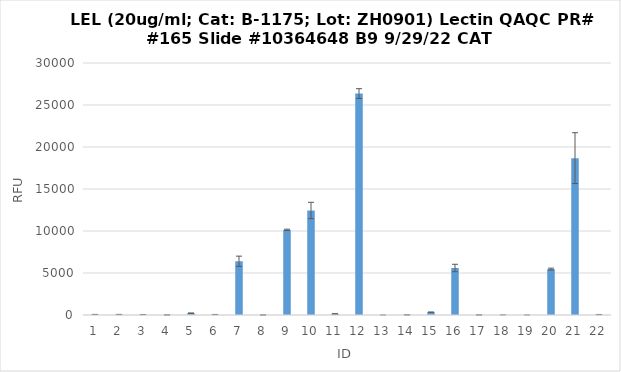
| Category | RFU |
|---|---|
| 0 | 64.5 |
| 1 | 59.75 |
| 2 | 53.25 |
| 3 | 9 |
| 4 | 219 |
| 5 | 57 |
| 6 | 6399.25 |
| 7 | 2.5 |
| 8 | 10135.25 |
| 9 | 12440.5 |
| 10 | 132.5 |
| 11 | 26361.25 |
| 12 | 0.25 |
| 13 | 18.25 |
| 14 | 331.5 |
| 15 | 5594.5 |
| 16 | 8.25 |
| 17 | 5.5 |
| 18 | 1.25 |
| 19 | 5461.75 |
| 20 | 18674.75 |
| 21 | 53.75 |